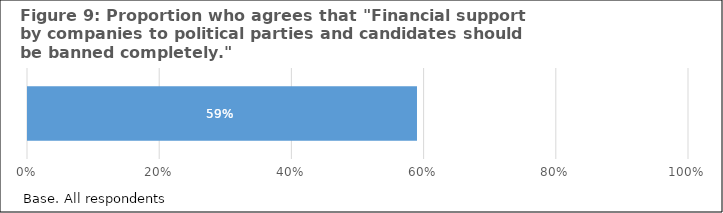
| Category | Series 0 |
|---|---|
| 0 | 0.59 |